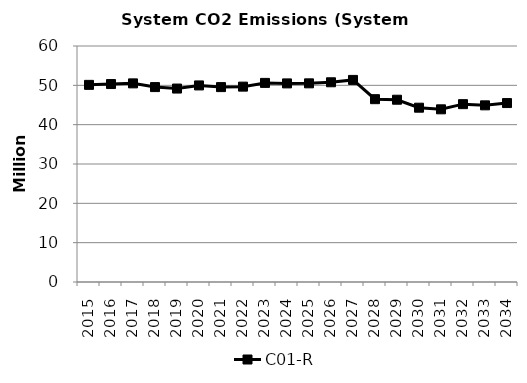
| Category | C01-R |
|---|---|
| 2015.0 | 50.118 |
| 2016.0 | 50.329 |
| 2017.0 | 50.499 |
| 2018.0 | 49.555 |
| 2019.0 | 49.181 |
| 2020.0 | 49.976 |
| 2021.0 | 49.548 |
| 2022.0 | 49.671 |
| 2023.0 | 50.618 |
| 2024.0 | 50.491 |
| 2025.0 | 50.508 |
| 2026.0 | 50.777 |
| 2027.0 | 51.38 |
| 2028.0 | 46.481 |
| 2029.0 | 46.342 |
| 2030.0 | 44.317 |
| 2031.0 | 43.901 |
| 2032.0 | 45.215 |
| 2033.0 | 44.915 |
| 2034.0 | 45.496 |